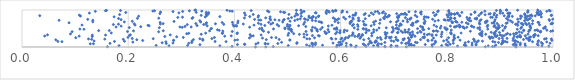
| Category | Series 0 |
|---|---|
| 0.4397582424768291 | 0.001 |
| 0.9306065013908572 | 0.002 |
| 0.45905064466568135 | 0.003 |
| 0.7237459221952459 | 0.004 |
| 0.627939035113636 | 0.005 |
| 0.6833654984516622 | 0.006 |
| 0.8725762796969696 | 0.007 |
| 0.16093497196341988 | 0.008 |
| 0.592542413880383 | 0.009 |
| 0.4730334914781309 | 0.01 |
| 0.8861221907580672 | 0.011 |
| 0.6947858666441654 | 0.012 |
| 0.683654880736637 | 0.013 |
| 0.3955928365395567 | 0.014 |
| 0.5476568008945845 | 0.015 |
| 0.6479818516568191 | 0.016 |
| 0.8899949662903974 | 0.017 |
| 0.7726067595610066 | 0.018 |
| 0.6707475994850652 | 0.019 |
| 0.9288758335606171 | 0.02 |
| 0.9922326241957272 | 0.021 |
| 0.7067391578996007 | 0.022 |
| 0.8201820290631205 | 0.023 |
| 0.6106738642838067 | 0.024 |
| 0.7044417234368779 | 0.025 |
| 0.6294474489301293 | 0.026 |
| 0.5413794025680093 | 0.027 |
| 0.9792913036521915 | 0.028 |
| 0.8780104582182556 | 0.029 |
| 0.37267117728008076 | 0.03 |
| 0.2768716669511784 | 0.031 |
| 0.9480298406155264 | 0.032 |
| 0.6199840227202453 | 0.033 |
| 0.6619571355454509 | 0.034 |
| 0.18266965576157063 | 0.035 |
| 0.8361605614147365 | 0.036 |
| 0.3117633460813789 | 0.037 |
| 0.790365009153304 | 0.038 |
| 0.5014256973000555 | 0.039 |
| 0.801803901243772 | 0.04 |
| 0.7383309946841438 | 0.041 |
| 0.2526202056550569 | 0.042 |
| 0.8339017023034863 | 0.043 |
| 0.6952844717494677 | 0.044 |
| 0.5971870194827564 | 0.045 |
| 0.7336272615109689 | 0.046 |
| 0.5660099925702582 | 0.047 |
| 0.7288850378932779 | 0.048 |
| 0.5933533301236843 | 0.049 |
| 0.6692634076765457 | 0.05 |
| 0.8923122747983209 | 0.051 |
| 0.9721107230061647 | 0.052 |
| 0.8552057277014337 | 0.053 |
| 0.8475790365505581 | 0.054 |
| 0.9308096741542663 | 0.055 |
| 0.6450869756310679 | 0.056 |
| 0.5359674929827138 | 0.057 |
| 0.6190773410810242 | 0.058 |
| 0.8329864053565965 | 0.059 |
| 0.772175240070705 | 0.06 |
| 0.9383104013218859 | 0.061 |
| 0.3350387867544831 | 0.062 |
| 0.5523770347545228 | 0.063 |
| 0.9250413176067294 | 0.064 |
| 0.6000381439607686 | 0.065 |
| 0.4057358930435871 | 0.066 |
| 0.7595085625792112 | 0.067 |
| 0.7986880469913847 | 0.068 |
| 0.6522755969845091 | 0.069 |
| 0.4194467273299296 | 0.07 |
| 0.5466725327784752 | 0.071 |
| 0.7324114684003323 | 0.072 |
| 0.8550696682368828 | 0.073 |
| 0.806328378153701 | 0.074 |
| 0.6020656587611511 | 0.075 |
| 0.4190033491986625 | 0.076 |
| 0.9703848851121417 | 0.077 |
| 0.7326744415356399 | 0.078 |
| 0.9029811242468271 | 0.079 |
| 0.6768479442541693 | 0.08 |
| 0.4404542227759458 | 0.081 |
| 0.6426695310158304 | 0.082 |
| 0.9472907652219515 | 0.083 |
| 0.7761549709987637 | 0.084 |
| 0.46326782165340946 | 0.085 |
| 0.128500594103624 | 0.086 |
| 0.45808541655429097 | 0.087 |
| 0.1344220684928971 | 0.088 |
| 0.6714808646532138 | 0.089 |
| 0.9802851968661976 | 0.09 |
| 0.7227599620286055 | 0.091 |
| 0.5476559091503768 | 0.092 |
| 0.4817701208243884 | 0.093 |
| 0.27179629245290976 | 0.094 |
| 0.4582539838530219 | 0.095 |
| 0.5174969212528008 | 0.096 |
| 0.928099881278443 | 0.097 |
| 0.16577344483976106 | 0.098 |
| 0.6108727488720841 | 0.099 |
| 0.31403229731486565 | 0.1 |
| 0.8123347312741905 | 0.101 |
| 0.9943878482873181 | 0.102 |
| 0.5457206383565661 | 0.103 |
| 0.9385067285459505 | 0.104 |
| 0.7283064310556521 | 0.105 |
| 0.5857476662627418 | 0.106 |
| 0.28437573407253375 | 0.107 |
| 0.8476666464722052 | 0.108 |
| 0.4446778232376353 | 0.109 |
| 0.5528912196933847 | 0.11 |
| 0.714909511922426 | 0.111 |
| 0.726097819725797 | 0.112 |
| 0.6582129797654425 | 0.113 |
| 0.9054849382932397 | 0.114 |
| 0.263945958838259 | 0.115 |
| 0.8347812338674323 | 0.116 |
| 0.7441785159034859 | 0.117 |
| 0.5179235221876486 | 0.118 |
| 0.6554074812832449 | 0.119 |
| 0.978014111455429 | 0.12 |
| 0.3197570025185871 | 0.121 |
| 0.5966648548342794 | 0.122 |
| 0.8973264029374248 | 0.123 |
| 0.6834927672056559 | 0.124 |
| 0.6650257340749395 | 0.125 |
| 0.48884590701903197 | 0.126 |
| 0.741009175812642 | 0.127 |
| 0.9049097139846919 | 0.128 |
| 0.5993736760383804 | 0.129 |
| 0.7789724845145493 | 0.13 |
| 0.8029887373958056 | 0.131 |
| 0.20873162991225366 | 0.132 |
| 0.8906480461428249 | 0.133 |
| 0.9135301137160078 | 0.134 |
| 0.8569139575846726 | 0.135 |
| 0.9336825593443574 | 0.136 |
| 0.6648367952596044 | 0.137 |
| 0.6552610683249024 | 0.138 |
| 0.9881876928510416 | 0.139 |
| 0.9717037782528212 | 0.14 |
| 0.2709669070166084 | 0.141 |
| 0.840784952578503 | 0.142 |
| 0.9615437111511197 | 0.143 |
| 0.0752330270776588 | 0.144 |
| 0.6675978947679491 | 0.145 |
| 0.3843443753921758 | 0.146 |
| 0.9098107727249628 | 0.147 |
| 0.886687853121969 | 0.148 |
| 0.3636486608411398 | 0.149 |
| 0.06757905644450751 | 0.15 |
| 0.17415501083521728 | 0.151 |
| 0.8526609079278437 | 0.152 |
| 0.7001294252184086 | 0.153 |
| 0.19301128861674618 | 0.154 |
| 0.6042471286513494 | 0.155 |
| 0.6559565395820836 | 0.156 |
| 0.778521484543587 | 0.157 |
| 0.8671423556707127 | 0.158 |
| 0.9295267946281064 | 0.159 |
| 0.3200716660214945 | 0.16 |
| 0.7292195772132313 | 0.161 |
| 0.13576714626574882 | 0.162 |
| 0.9280402782555909 | 0.163 |
| 0.7940986808306106 | 0.164 |
| 0.7648530476050951 | 0.165 |
| 0.905989669473316 | 0.166 |
| 0.8593733833149108 | 0.167 |
| 0.9290235429054389 | 0.168 |
| 0.6954909473677985 | 0.169 |
| 0.6665997862081255 | 0.17 |
| 0.9726858438960366 | 0.171 |
| 0.8120204125184383 | 0.172 |
| 0.9056504279604051 | 0.173 |
| 0.9547303136482571 | 0.174 |
| 0.22728748999846282 | 0.175 |
| 0.2854671600535836 | 0.176 |
| 0.7078144893543508 | 0.177 |
| 0.9978623721093367 | 0.178 |
| 0.9249161931790494 | 0.179 |
| 0.3405799540827344 | 0.18 |
| 0.28549859494760416 | 0.181 |
| 0.7071028473175551 | 0.182 |
| 0.772064888886028 | 0.183 |
| 0.40088916529883634 | 0.184 |
| 0.8249988537032112 | 0.185 |
| 0.764256107716562 | 0.186 |
| 0.5043405717286213 | 0.187 |
| 0.956470822949223 | 0.188 |
| 0.7178688076475236 | 0.189 |
| 0.5046179421882743 | 0.19 |
| 0.7998688682587701 | 0.191 |
| 0.9561568080405116 | 0.192 |
| 0.405796986752596 | 0.193 |
| 0.06369873648318244 | 0.194 |
| 0.7297657459621126 | 0.195 |
| 0.643721035615434 | 0.196 |
| 0.21626446475492636 | 0.197 |
| 0.8512992015559172 | 0.198 |
| 0.4600756055984458 | 0.199 |
| 0.32280928368547335 | 0.2 |
| 0.7506452984735504 | 0.201 |
| 0.704971641212876 | 0.202 |
| 0.9445942750561502 | 0.203 |
| 0.8130062444618413 | 0.204 |
| 0.4842982283725431 | 0.205 |
| 0.6764771922721993 | 0.206 |
| 0.1907557632537843 | 0.207 |
| 0.13119193756320596 | 0.208 |
| 0.340425235328573 | 0.209 |
| 0.8505088533787807 | 0.21 |
| 0.6076904006754811 | 0.211 |
| 0.7178189693155569 | 0.212 |
| 0.15598364822997682 | 0.213 |
| 0.6004841881846844 | 0.214 |
| 0.5836501632658271 | 0.215 |
| 0.9840563760734663 | 0.216 |
| 0.12527609103149326 | 0.217 |
| 0.5910541176758058 | 0.218 |
| 0.9967520239593749 | 0.219 |
| 0.5417601212198916 | 0.22 |
| 0.536660113120931 | 0.221 |
| 0.7200952417454632 | 0.222 |
| 0.33497940721588515 | 0.223 |
| 0.9532053968276173 | 0.224 |
| 0.24711499053800134 | 0.225 |
| 0.6529362121278061 | 0.226 |
| 0.3575578873032818 | 0.227 |
| 0.9873271934120542 | 0.228 |
| 0.8984598607150192 | 0.229 |
| 0.2075782404318102 | 0.23 |
| 0.8817115414730372 | 0.231 |
| 0.9251681802679272 | 0.232 |
| 0.913402082103097 | 0.233 |
| 0.8148092712689423 | 0.234 |
| 0.6365866434000123 | 0.235 |
| 0.5823099655253737 | 0.236 |
| 0.6024335985289277 | 0.237 |
| 0.9501260295517759 | 0.238 |
| 0.6847414355846674 | 0.239 |
| 0.45287333171246524 | 0.24 |
| 0.9047321245259362 | 0.241 |
| 0.6928400171269505 | 0.242 |
| 0.7749526458169351 | 0.243 |
| 0.7276537164617517 | 0.244 |
| 0.42841625753314244 | 0.245 |
| 0.8869406969678225 | 0.246 |
| 0.6695280034562198 | 0.247 |
| 0.5509173140791381 | 0.248 |
| 0.7575674883557049 | 0.249 |
| 0.8033240132623437 | 0.25 |
| 0.10127520197496556 | 0.251 |
| 0.6140268317693196 | 0.252 |
| 0.6096043672017895 | 0.253 |
| 0.47833119720412726 | 0.254 |
| 0.6746718681869771 | 0.255 |
| 0.4698667691678758 | 0.256 |
| 0.36236454568616333 | 0.257 |
| 0.30380434805095496 | 0.258 |
| 0.7548897008068617 | 0.259 |
| 0.6918806689814829 | 0.26 |
| 0.1995789252691707 | 0.261 |
| 0.7039730214280847 | 0.262 |
| 0.9557090888999689 | 0.263 |
| 0.8213752064961062 | 0.264 |
| 0.7329581750357338 | 0.265 |
| 0.9326393539542939 | 0.266 |
| 0.6953681367594868 | 0.267 |
| 0.5313854888896647 | 0.268 |
| 0.884070524171767 | 0.269 |
| 0.9576853639201416 | 0.27 |
| 0.8135335085496259 | 0.271 |
| 0.9390027333543158 | 0.272 |
| 0.9638244978731638 | 0.273 |
| 0.8797301039294866 | 0.274 |
| 0.7335799470401801 | 0.275 |
| 0.2913126820844504 | 0.276 |
| 0.6384264889476642 | 0.277 |
| 0.9383727708650739 | 0.278 |
| 0.7577195908331642 | 0.279 |
| 0.9378261046701984 | 0.28 |
| 0.9329993775249009 | 0.281 |
| 0.7897527820734499 | 0.282 |
| 0.1322804789881547 | 0.283 |
| 0.8931094928199063 | 0.284 |
| 0.2690088508758282 | 0.285 |
| 0.6860968598795508 | 0.286 |
| 0.6323168391732525 | 0.287 |
| 0.6270578813814057 | 0.288 |
| 0.7401320176136307 | 0.289 |
| 0.43149100870509427 | 0.29 |
| 0.9270412657977214 | 0.291 |
| 0.8909109748626789 | 0.292 |
| 0.3818133725040228 | 0.293 |
| 0.10767000283172662 | 0.294 |
| 0.6164502444612769 | 0.295 |
| 0.04277510151570869 | 0.296 |
| 0.9383155314214834 | 0.297 |
| 0.5599288610829584 | 0.298 |
| 0.7339793131148543 | 0.299 |
| 0.8663436219162478 | 0.3 |
| 0.3940512308593839 | 0.301 |
| 0.4354093628040043 | 0.302 |
| 0.6585926227296713 | 0.303 |
| 0.907486193780197 | 0.304 |
| 0.9478239562979881 | 0.305 |
| 0.9721366931927745 | 0.306 |
| 0.8948887928138027 | 0.307 |
| 0.558103736442747 | 0.308 |
| 0.903756483611857 | 0.309 |
| 0.5468694376664684 | 0.31 |
| 0.9635302784001093 | 0.311 |
| 0.9644842453515979 | 0.312 |
| 0.7721972538403773 | 0.313 |
| 0.6214975960028959 | 0.314 |
| 0.20258668387123918 | 0.315 |
| 0.6342073030580457 | 0.316 |
| 0.5009856217987457 | 0.317 |
| 0.9373905382287913 | 0.318 |
| 0.8140254716205799 | 0.319 |
| 0.6413728795622653 | 0.32 |
| 0.1323585290870167 | 0.321 |
| 0.7801532112422994 | 0.322 |
| 0.15735276555535976 | 0.323 |
| 0.900574054337971 | 0.324 |
| 0.966599307594584 | 0.325 |
| 0.4503115197978316 | 0.326 |
| 0.27915740293504526 | 0.327 |
| 0.20406522393300977 | 0.328 |
| 0.048002066363245215 | 0.329 |
| 0.863275429781671 | 0.33 |
| 0.5365755803726542 | 0.331 |
| 0.7633150451915186 | 0.332 |
| 0.7722121767343232 | 0.333 |
| 0.42956704102181137 | 0.334 |
| 0.7306973728610897 | 0.335 |
| 0.7364073712718966 | 0.336 |
| 0.641016004079567 | 0.337 |
| 0.9113689854145689 | 0.338 |
| 0.9193591676338525 | 0.339 |
| 0.6844919243712689 | 0.34 |
| 0.5223886270704037 | 0.341 |
| 0.9658052426322717 | 0.342 |
| 0.6346642572054112 | 0.343 |
| 0.8732332223941051 | 0.344 |
| 0.33745249567191776 | 0.345 |
| 0.9528447538738447 | 0.346 |
| 0.790230808259809 | 0.347 |
| 0.5309175241245954 | 0.348 |
| 0.7669183985114635 | 0.349 |
| 0.6236419253433851 | 0.35 |
| 0.7574282411804071 | 0.351 |
| 0.888906339003526 | 0.352 |
| 0.09125663644659217 | 0.353 |
| 0.8893547025487426 | 0.354 |
| 0.8616971853195803 | 0.355 |
| 0.925804261104407 | 0.356 |
| 0.8086095876797492 | 0.357 |
| 0.8660820194980356 | 0.358 |
| 0.31021970955999456 | 0.359 |
| 0.5905454488080464 | 0.36 |
| 0.511677647508238 | 0.361 |
| 0.4050015646725836 | 0.362 |
| 0.8909879497326996 | 0.363 |
| 0.807615867350336 | 0.364 |
| 0.9143068638427397 | 0.365 |
| 0.9300447147616225 | 0.366 |
| 0.5719408606368248 | 0.367 |
| 0.658749520598123 | 0.368 |
| 0.3771929921947803 | 0.369 |
| 0.31400644686461987 | 0.37 |
| 0.5022559265387744 | 0.371 |
| 0.9317662481246844 | 0.372 |
| 0.5735837317458974 | 0.373 |
| 0.34584374171806487 | 0.374 |
| 0.377754419086543 | 0.375 |
| 0.9306590191834921 | 0.376 |
| 0.6875705143875184 | 0.377 |
| 0.8269690435156477 | 0.378 |
| 0.7310768682445552 | 0.379 |
| 0.16813161498970658 | 0.38 |
| 0.40553789429519205 | 0.381 |
| 0.6231406454349024 | 0.382 |
| 0.5983551639823474 | 0.383 |
| 0.7449677804589271 | 0.384 |
| 0.8650427792334697 | 0.385 |
| 0.6477471133566293 | 0.386 |
| 0.7071818943540101 | 0.387 |
| 0.9413620759191175 | 0.388 |
| 0.8896786310614159 | 0.389 |
| 0.8075012633479544 | 0.39 |
| 0.6838753749929544 | 0.391 |
| 0.899172732252995 | 0.392 |
| 0.5984717712034879 | 0.393 |
| 0.7169331959878289 | 0.394 |
| 0.7077388127858865 | 0.395 |
| 0.8837314683452675 | 0.396 |
| 0.6968024377208917 | 0.397 |
| 0.46419912556103327 | 0.398 |
| 0.7217553941247067 | 0.399 |
| 0.727199028557434 | 0.4 |
| 0.7514422067314047 | 0.401 |
| 0.5929545219011392 | 0.402 |
| 0.7910412057631161 | 0.403 |
| 0.7257643552894264 | 0.404 |
| 0.6064049901106701 | 0.405 |
| 0.6622374903368426 | 0.406 |
| 0.7353053690954604 | 0.407 |
| 0.9760382143322068 | 0.408 |
| 0.9364601292404071 | 0.409 |
| 0.5779525101868769 | 0.41 |
| 0.9764525048838149 | 0.411 |
| 0.2573327728150806 | 0.412 |
| 0.5702004911179603 | 0.413 |
| 0.09437030183568973 | 0.414 |
| 0.5080295730922351 | 0.415 |
| 0.8664512950473483 | 0.416 |
| 0.19862493518261815 | 0.417 |
| 0.9543460136038999 | 0.418 |
| 0.39591630602648303 | 0.419 |
| 0.5348402828142416 | 0.42 |
| 0.7497746006931828 | 0.421 |
| 0.9767573279313749 | 0.422 |
| 0.7828862827491727 | 0.423 |
| 0.9958225264964806 | 0.424 |
| 0.8444046191148235 | 0.425 |
| 0.5562537895796988 | 0.426 |
| 0.45492366267047624 | 0.427 |
| 0.7752794716475954 | 0.428 |
| 0.8925721100044943 | 0.429 |
| 0.7139379317727739 | 0.43 |
| 0.3782078684789347 | 0.431 |
| 0.5458536222928128 | 0.432 |
| 0.774359293058749 | 0.433 |
| 0.6991214328752569 | 0.434 |
| 0.3533247935655623 | 0.435 |
| 0.20997098180163556 | 0.436 |
| 0.9995302081348104 | 0.437 |
| 0.7802727511111209 | 0.438 |
| 0.2660563952142053 | 0.439 |
| 0.612127321763619 | 0.44 |
| 0.9717304232193864 | 0.441 |
| 0.5991131155535181 | 0.442 |
| 0.14441217314347402 | 0.443 |
| 0.9057536938091564 | 0.444 |
| 0.16443372750943527 | 0.445 |
| 0.6493858697671615 | 0.446 |
| 0.9449945537182584 | 0.447 |
| 0.9550965893297102 | 0.448 |
| 0.6534009197847379 | 0.449 |
| 0.3714163061043407 | 0.45 |
| 0.9661543551997518 | 0.451 |
| 0.5552788745730051 | 0.452 |
| 0.9885584063460031 | 0.453 |
| 0.6680577492714033 | 0.454 |
| 0.9447030185513792 | 0.455 |
| 0.6073600719967427 | 0.456 |
| 0.8085145129333529 | 0.457 |
| 0.5064105209721986 | 0.458 |
| 0.5061868303599949 | 0.459 |
| 0.4525208417623794 | 0.46 |
| 0.5066500152016172 | 0.461 |
| 0.7211981398417424 | 0.462 |
| 0.5453339862194542 | 0.463 |
| 0.9699580513113201 | 0.464 |
| 0.3680944734384801 | 0.465 |
| 0.9568231733893174 | 0.466 |
| 0.7566279123156068 | 0.467 |
| 0.6623454993203645 | 0.468 |
| 0.8623161462387768 | 0.469 |
| 0.576368646710749 | 0.47 |
| 0.7991223092247441 | 0.471 |
| 0.5073190716734 | 0.472 |
| 0.7285762267821341 | 0.473 |
| 0.5556260725051432 | 0.474 |
| 0.7548461778026151 | 0.475 |
| 0.7094715485555365 | 0.476 |
| 0.6324249347674801 | 0.477 |
| 0.9327216717150141 | 0.478 |
| 0.5623190617868857 | 0.479 |
| 0.11670459450904669 | 0.48 |
| 0.5933334121029632 | 0.481 |
| 0.5911982141877167 | 0.482 |
| 0.8772266558133017 | 0.483 |
| 0.8956918027311016 | 0.484 |
| 0.10902680532328327 | 0.485 |
| 0.6437336374317945 | 0.486 |
| 0.8008972789323073 | 0.487 |
| 0.4735554824061505 | 0.488 |
| 0.5017908197074367 | 0.489 |
| 0.6479259949366393 | 0.49 |
| 0.35569491826592486 | 0.491 |
| 0.6994402329345224 | 0.492 |
| 0.44741831551215067 | 0.493 |
| 0.588119265435381 | 0.494 |
| 0.4952048128694363 | 0.495 |
| 0.7660489869024587 | 0.496 |
| 0.7449105299165746 | 0.497 |
| 0.6425418710658981 | 0.498 |
| 0.7076771760443981 | 0.499 |
| 0.8971088044200781 | 0.5 |
| 0.5036670099445745 | 0.501 |
| 0.35691960533679784 | 0.502 |
| 0.7970808545523853 | 0.503 |
| 0.7047147400772913 | 0.504 |
| 0.9393174665378741 | 0.505 |
| 0.9821393435837774 | 0.506 |
| 0.8331046888662332 | 0.507 |
| 0.9853371174019026 | 0.508 |
| 0.9092017239550689 | 0.509 |
| 0.7877520503893366 | 0.51 |
| 0.4515248126605207 | 0.511 |
| 0.7057699002690104 | 0.512 |
| 0.858401886105906 | 0.513 |
| 0.6724051224375442 | 0.514 |
| 0.49520854850770696 | 0.515 |
| 0.6257871621664433 | 0.516 |
| 0.5520140914185067 | 0.517 |
| 0.6859914005234733 | 0.518 |
| 0.9583485420458052 | 0.519 |
| 0.5926095680074123 | 0.52 |
| 0.8957794562277853 | 0.521 |
| 0.2586587460809253 | 0.522 |
| 0.7963676716264636 | 0.523 |
| 0.8925022271983564 | 0.524 |
| 0.20210926118341077 | 0.525 |
| 0.8619033738934636 | 0.526 |
| 0.7540042189656043 | 0.527 |
| 0.565564556125157 | 0.528 |
| 0.8990476181887813 | 0.529 |
| 0.8312559500308712 | 0.53 |
| 0.3017467832823765 | 0.531 |
| 0.6977476467204735 | 0.532 |
| 0.8377003498734362 | 0.533 |
| 0.547340582560207 | 0.534 |
| 0.8508955842159112 | 0.535 |
| 0.4287190629268465 | 0.536 |
| 0.940922843552737 | 0.537 |
| 0.8242742092570335 | 0.538 |
| 0.7544634026481551 | 0.539 |
| 0.17715394481415841 | 0.54 |
| 0.2973707125061305 | 0.541 |
| 0.3185987199246789 | 0.542 |
| 0.8143177793328796 | 0.543 |
| 0.8162364740971702 | 0.544 |
| 0.8303852502249235 | 0.545 |
| 0.9854633110000619 | 0.546 |
| 0.956537271071971 | 0.547 |
| 0.22366002756531614 | 0.548 |
| 0.9106070608501289 | 0.549 |
| 0.7807477279601323 | 0.55 |
| 0.8762427272847193 | 0.551 |
| 0.5344627606167861 | 0.552 |
| 0.8255471987557786 | 0.553 |
| 0.5034640079121577 | 0.554 |
| 0.3068609239454137 | 0.555 |
| 0.8887930224161574 | 0.556 |
| 0.8470272622844268 | 0.557 |
| 0.6328866432808256 | 0.558 |
| 0.7505800263541649 | 0.559 |
| 0.49974601882258934 | 0.56 |
| 0.8186284859397923 | 0.561 |
| 0.39910678506194164 | 0.562 |
| 0.7891155428104654 | 0.563 |
| 0.4040487585549022 | 0.564 |
| 0.1866974013666697 | 0.565 |
| 0.8067630218850814 | 0.566 |
| 0.5768761316892562 | 0.567 |
| 0.4835448475793458 | 0.568 |
| 0.7107364259470631 | 0.569 |
| 0.8465838436708267 | 0.57 |
| 0.3487421172283794 | 0.571 |
| 0.6575325025850626 | 0.572 |
| 0.8242019116861888 | 0.573 |
| 0.23944088583046516 | 0.574 |
| 0.5209410717153448 | 0.575 |
| 0.9568597731290482 | 0.576 |
| 0.9046994722486161 | 0.577 |
| 0.6222792906805105 | 0.578 |
| 0.32972805708251 | 0.579 |
| 0.4032028552107226 | 0.58 |
| 0.4573059051262478 | 0.581 |
| 0.8976738568246455 | 0.582 |
| 0.8901750081580033 | 0.583 |
| 0.9335465145350124 | 0.584 |
| 0.7360768964952152 | 0.585 |
| 0.23723640328683065 | 0.586 |
| 0.504775214650162 | 0.587 |
| 0.8771006727124563 | 0.588 |
| 0.5837366380804777 | 0.589 |
| 0.7760323166920454 | 0.59 |
| 0.436910383225852 | 0.591 |
| 0.2129153464970628 | 0.592 |
| 0.11299510689083399 | 0.593 |
| 0.6477328736530771 | 0.594 |
| 0.7050443432663019 | 0.595 |
| 0.7330664650047649 | 0.596 |
| 0.8230293854156107 | 0.597 |
| 0.644495271912072 | 0.598 |
| 0.7143759147095476 | 0.599 |
| 0.39749687386849464 | 0.6 |
| 0.9745924668387753 | 0.601 |
| 0.9437029654439902 | 0.602 |
| 0.950456811035251 | 0.603 |
| 0.6319804681746662 | 0.604 |
| 0.311200734451991 | 0.605 |
| 0.48054610717710905 | 0.606 |
| 0.1720832573118226 | 0.607 |
| 0.3421369431141265 | 0.608 |
| 0.49996521092571194 | 0.609 |
| 0.6242338878570604 | 0.61 |
| 0.6632013986250631 | 0.611 |
| 0.3800041619326859 | 0.612 |
| 0.4501027722646903 | 0.613 |
| 0.9295550527359767 | 0.614 |
| 0.5303845328599232 | 0.615 |
| 0.18165480514217458 | 0.616 |
| 0.46867976010567186 | 0.617 |
| 0.644592514138406 | 0.618 |
| 0.8621724792119373 | 0.619 |
| 0.416761075847265 | 0.62 |
| 0.34623242978135393 | 0.621 |
| 0.2605842254949567 | 0.622 |
| 0.9962677664694655 | 0.623 |
| 0.8403045926779702 | 0.624 |
| 0.9323778217305586 | 0.625 |
| 0.7124481829154162 | 0.626 |
| 0.36429881252080065 | 0.627 |
| 0.2112542071559908 | 0.628 |
| 0.9612299437373506 | 0.629 |
| 0.2657662263110686 | 0.63 |
| 0.9418571195767648 | 0.631 |
| 0.6179502711275329 | 0.632 |
| 0.7578994285825571 | 0.633 |
| 0.327365576610013 | 0.634 |
| 0.9546409817547337 | 0.635 |
| 0.8948256467352117 | 0.636 |
| 0.9403848864414255 | 0.637 |
| 0.9992244569010617 | 0.638 |
| 0.6735806428860701 | 0.639 |
| 0.91174186795795 | 0.64 |
| 0.44520372025370275 | 0.641 |
| 0.7362872518030178 | 0.642 |
| 0.7356875143673933 | 0.643 |
| 0.9980912248731872 | 0.644 |
| 0.9482419533691643 | 0.645 |
| 0.8613060839913339 | 0.646 |
| 0.8851931614268699 | 0.647 |
| 0.47222594936327955 | 0.648 |
| 0.8884839477979161 | 0.649 |
| 0.4063235417693632 | 0.65 |
| 0.7570926139032974 | 0.651 |
| 0.8369572550549146 | 0.652 |
| 0.9137457279278554 | 0.653 |
| 0.08859858180728693 | 0.654 |
| 0.872966014179253 | 0.655 |
| 0.3476316560728441 | 0.656 |
| 0.5956426379460177 | 0.657 |
| 0.5643777180042086 | 0.658 |
| 0.9733828573492266 | 0.659 |
| 0.8102114013204098 | 0.66 |
| 0.8110221468609817 | 0.661 |
| 0.37703341297063736 | 0.662 |
| 0.2601298517258737 | 0.663 |
| 0.39627088603439037 | 0.664 |
| 0.4645718292059551 | 0.665 |
| 0.5322964775590321 | 0.666 |
| 0.971720359207996 | 0.667 |
| 0.828283234956335 | 0.668 |
| 0.9235486080579157 | 0.669 |
| 0.8192832985253917 | 0.67 |
| 0.6178068231238305 | 0.671 |
| 0.7420442791326882 | 0.672 |
| 0.6621381188252041 | 0.673 |
| 0.705275431042495 | 0.674 |
| 0.33663486782665725 | 0.675 |
| 0.4909889721340182 | 0.676 |
| 0.5631113868096896 | 0.677 |
| 0.19267355064163386 | 0.678 |
| 0.9349211647425589 | 0.679 |
| 0.133302191504126 | 0.68 |
| 0.7260575796304463 | 0.681 |
| 0.6939376778171334 | 0.682 |
| 0.5594221971750233 | 0.683 |
| 0.7428242243010414 | 0.684 |
| 0.8729187189956303 | 0.685 |
| 0.8094227918931025 | 0.686 |
| 0.8168172732015406 | 0.687 |
| 0.6207689159229719 | 0.688 |
| 0.8898141452376609 | 0.689 |
| 0.5893560960215231 | 0.69 |
| 0.28627827447174137 | 0.691 |
| 0.6427418379634366 | 0.692 |
| 0.7591213765107552 | 0.693 |
| 0.8170087731460449 | 0.694 |
| 0.8759583461624324 | 0.695 |
| 0.2077622522866688 | 0.696 |
| 0.5048049093934597 | 0.697 |
| 0.7453958149330172 | 0.698 |
| 0.6658065498936202 | 0.699 |
| 0.777603287251048 | 0.7 |
| 0.4068578257419469 | 0.701 |
| 0.7175591960425473 | 0.702 |
| 0.6202454242485174 | 0.703 |
| 0.8755238967916023 | 0.704 |
| 0.9201375707887172 | 0.705 |
| 0.8621520061181469 | 0.706 |
| 0.8451597999123093 | 0.707 |
| 0.5530131206307651 | 0.708 |
| 0.961723604637486 | 0.709 |
| 0.946492461997466 | 0.71 |
| 0.3348748120445132 | 0.711 |
| 0.6350410811866388 | 0.712 |
| 0.8422588170065753 | 0.713 |
| 0.6335825486636922 | 0.714 |
| 0.7082168186154038 | 0.715 |
| 0.9933596558900214 | 0.716 |
| 0.5138031759075337 | 0.717 |
| 0.5467635806881079 | 0.718 |
| 0.7840028714003007 | 0.719 |
| 0.8041424105698766 | 0.72 |
| 0.4922677766252274 | 0.721 |
| 0.06983769454853675 | 0.722 |
| 0.48420844665144464 | 0.723 |
| 0.13340483157331254 | 0.724 |
| 0.7968631135178891 | 0.725 |
| 0.44969431904667123 | 0.726 |
| 0.8021104582670051 | 0.727 |
| 0.44594909484184897 | 0.728 |
| 0.538157073676725 | 0.729 |
| 0.9158504324107183 | 0.73 |
| 0.4682330553684578 | 0.731 |
| 0.5933154368747932 | 0.732 |
| 0.9521395703346948 | 0.733 |
| 0.6746321593508933 | 0.734 |
| 0.8907479290786313 | 0.735 |
| 0.476297036440389 | 0.736 |
| 0.8644814675660629 | 0.737 |
| 0.795018591606048 | 0.738 |
| 0.18658398698005563 | 0.739 |
| 0.9927157071406891 | 0.74 |
| 0.7257121385243984 | 0.741 |
| 0.949853619686599 | 0.742 |
| 0.8396831052263438 | 0.743 |
| 0.4937443197679632 | 0.744 |
| 0.5189981322133586 | 0.745 |
| 0.43804325408194483 | 0.746 |
| 0.1237868423368455 | 0.747 |
| 0.5337455050497082 | 0.748 |
| 0.7732741553929248 | 0.749 |
| 0.9541614533784325 | 0.75 |
| 0.7304740959050776 | 0.751 |
| 0.9995078395184136 | 0.752 |
| 0.9334726860148049 | 0.753 |
| 0.757063770730143 | 0.754 |
| 0.5892980332181431 | 0.755 |
| 0.6239790107095271 | 0.756 |
| 0.806533300820085 | 0.757 |
| 0.8562839004120061 | 0.758 |
| 0.6091898707371303 | 0.759 |
| 0.7309153681154232 | 0.76 |
| 0.5239793626573284 | 0.761 |
| 0.5962536949594691 | 0.762 |
| 0.5320033740086024 | 0.763 |
| 0.6463834333019265 | 0.764 |
| 0.6824510637726816 | 0.765 |
| 0.8532858706209441 | 0.766 |
| 0.466890774928336 | 0.767 |
| 0.5015214898443082 | 0.768 |
| 0.9386127625587058 | 0.769 |
| 0.1818278452666692 | 0.77 |
| 0.9125562054713491 | 0.771 |
| 0.8147889042655404 | 0.772 |
| 0.2174109215128717 | 0.773 |
| 0.3203525949323387 | 0.774 |
| 0.9575065169603105 | 0.775 |
| 0.8149092956961028 | 0.776 |
| 0.8080417138228706 | 0.777 |
| 0.5460370611439309 | 0.778 |
| 0.2575581327384289 | 0.779 |
| 0.8430546368999491 | 0.78 |
| 0.8562250196668031 | 0.781 |
| 0.6337278961517178 | 0.782 |
| 0.7327274899987493 | 0.783 |
| 0.418808314946449 | 0.784 |
| 0.5453256101222822 | 0.785 |
| 0.6230153798376021 | 0.786 |
| 0.45895856094142357 | 0.787 |
| 0.586178920746704 | 0.788 |
| 0.9476085069585245 | 0.789 |
| 0.6810200843482893 | 0.79 |
| 0.5538055160612624 | 0.791 |
| 0.7074595878100012 | 0.792 |
| 0.8073549363812031 | 0.793 |
| 0.7220448070139815 | 0.794 |
| 0.5074525069156993 | 0.795 |
| 0.3217242322346737 | 0.796 |
| 0.540875811651307 | 0.797 |
| 0.837832521776528 | 0.798 |
| 0.2934285099008445 | 0.799 |
| 0.7649450348927029 | 0.8 |
| 0.8857655301277881 | 0.801 |
| 0.6057605316074816 | 0.802 |
| 0.8827029027630283 | 0.803 |
| 0.8931201773207544 | 0.804 |
| 0.7094937493686637 | 0.805 |
| 0.3022782553543974 | 0.806 |
| 0.4446094717472335 | 0.807 |
| 0.949489513831473 | 0.808 |
| 0.6875989400381544 | 0.809 |
| 0.7613300228902281 | 0.81 |
| 0.8023339602322634 | 0.811 |
| 0.978014412338621 | 0.812 |
| 0.3450957916923665 | 0.813 |
| 0.4673126322330022 | 0.814 |
| 0.17345078409536957 | 0.815 |
| 0.7577277820827997 | 0.816 |
| 0.9167035132949463 | 0.817 |
| 0.7437790606781199 | 0.818 |
| 0.5480328639390203 | 0.819 |
| 0.6168686541367934 | 0.82 |
| 0.548222886049759 | 0.821 |
| 0.3725473243576014 | 0.822 |
| 0.4289216288452852 | 0.823 |
| 0.7073504410382081 | 0.824 |
| 0.9155121200371235 | 0.825 |
| 0.5584970628229554 | 0.826 |
| 0.9409746820306639 | 0.827 |
| 0.9233849184984784 | 0.828 |
| 0.6839111731377995 | 0.829 |
| 0.5260590208858767 | 0.83 |
| 0.5138024056278241 | 0.831 |
| 0.21962146534489121 | 0.832 |
| 0.9523628338408385 | 0.833 |
| 0.5404165295305684 | 0.834 |
| 0.6910468042144728 | 0.835 |
| 0.8247666001077005 | 0.836 |
| 0.11011543681073294 | 0.837 |
| 0.9605885289899775 | 0.838 |
| 0.9389271772151265 | 0.839 |
| 0.5589858372275256 | 0.84 |
| 0.6906507371009042 | 0.841 |
| 0.9665438454920194 | 0.842 |
| 0.9081943266447032 | 0.843 |
| 0.9558395846733504 | 0.844 |
| 0.44538533995865454 | 0.845 |
| 0.6538299870807626 | 0.846 |
| 0.033489048494669306 | 0.847 |
| 0.7773612932801046 | 0.848 |
| 0.34792741690712403 | 0.849 |
| 0.947892990913374 | 0.85 |
| 0.8603322301576767 | 0.851 |
| 0.7105797961904127 | 0.852 |
| 0.6916182393623335 | 0.853 |
| 0.9966179283071969 | 0.854 |
| 0.33744074996769463 | 0.855 |
| 0.740452042706678 | 0.856 |
| 0.9972434786436477 | 0.857 |
| 0.8235801450223379 | 0.858 |
| 0.8942411960031602 | 0.859 |
| 0.6232358389713 | 0.86 |
| 0.10796768699462943 | 0.861 |
| 0.42061604482088744 | 0.862 |
| 0.9170490674212665 | 0.863 |
| 0.6260260254771314 | 0.864 |
| 0.8889123396431055 | 0.865 |
| 0.9590873614845679 | 0.866 |
| 0.6278572914158029 | 0.867 |
| 0.8004431164709925 | 0.868 |
| 0.5189521103291255 | 0.869 |
| 0.8043839887020959 | 0.87 |
| 0.8722243315991506 | 0.871 |
| 0.9735645157115418 | 0.872 |
| 0.9764552800943721 | 0.873 |
| 0.7242749479779411 | 0.874 |
| 0.6445266880814416 | 0.875 |
| 0.18381837954890518 | 0.876 |
| 0.7799959867125322 | 0.877 |
| 0.8082595890445362 | 0.878 |
| 0.43544475586882514 | 0.879 |
| 0.8455183954200568 | 0.88 |
| 0.5027282233334013 | 0.881 |
| 0.8146956731913063 | 0.882 |
| 0.973094316889477 | 0.883 |
| 0.6616830199792577 | 0.884 |
| 0.9470956727152742 | 0.885 |
| 0.5171343896802044 | 0.886 |
| 0.7177658361550081 | 0.887 |
| 0.7213166270721716 | 0.888 |
| 0.970667553392707 | 0.889 |
| 0.7518375704654686 | 0.89 |
| 0.7143532341143527 | 0.891 |
| 0.8794163397296221 | 0.892 |
| 0.3467031727184156 | 0.893 |
| 0.3508997115567854 | 0.894 |
| 0.9466343012110967 | 0.895 |
| 0.8143813018838746 | 0.896 |
| 0.6845257887501146 | 0.897 |
| 0.8088063251504914 | 0.898 |
| 0.8636845517800044 | 0.899 |
| 0.8817013203471151 | 0.9 |
| 0.7056477909645301 | 0.901 |
| 0.6465612608645311 | 0.902 |
| 0.25971798355661635 | 0.903 |
| 0.5166012627386302 | 0.904 |
| 0.9782351428691162 | 0.905 |
| 0.573265218787338 | 0.906 |
| 0.5254936925397099 | 0.907 |
| 0.8192887171416556 | 0.908 |
| 0.6726502550569595 | 0.909 |
| 0.9148660134739681 | 0.91 |
| 0.7212999643441043 | 0.911 |
| 0.8898458681324567 | 0.912 |
| 0.9004279604582944 | 0.913 |
| 0.9052876243664841 | 0.914 |
| 0.8202781889369216 | 0.915 |
| 0.9190408756940127 | 0.916 |
| 0.12684940052005328 | 0.917 |
| 0.419099468557064 | 0.918 |
| 0.6287338177879027 | 0.919 |
| 0.9169280740536108 | 0.92 |
| 0.657807448870237 | 0.921 |
| 0.5539035868962844 | 0.922 |
| 0.29550002998377534 | 0.923 |
| 0.552417930008006 | 0.924 |
| 0.8045408267426597 | 0.925 |
| 0.6788711225805009 | 0.926 |
| 0.7747563798376504 | 0.927 |
| 0.35150841066211713 | 0.928 |
| 0.7503704642648833 | 0.929 |
| 0.8656866392209147 | 0.93 |
| 0.9698186650068339 | 0.931 |
| 0.19536085674648349 | 0.932 |
| 0.8525534227391021 | 0.933 |
| 0.4947591321048596 | 0.934 |
| 0.8282967820152823 | 0.935 |
| 0.32817776468511717 | 0.936 |
| 0.3473025794501584 | 0.937 |
| 0.9718754580400603 | 0.938 |
| 0.49262276727539844 | 0.939 |
| 0.6025261351917022 | 0.94 |
| 0.5726400433543731 | 0.941 |
| 0.5786761455482756 | 0.942 |
| 0.952309636765673 | 0.943 |
| 0.9528452640400423 | 0.944 |
| 0.6122415963679831 | 0.945 |
| 0.2609679908207949 | 0.946 |
| 0.527407406728812 | 0.947 |
| 0.8531502377542037 | 0.948 |
| 0.6806823834204139 | 0.949 |
| 0.4650567208252065 | 0.95 |
| 0.7518178355876297 | 0.951 |
| 0.486938215027406 | 0.952 |
| 0.7287734555930822 | 0.953 |
| 0.665215827629961 | 0.954 |
| 0.7409995520905843 | 0.955 |
| 0.7827542708630423 | 0.956 |
| 0.28430681890094106 | 0.957 |
| 0.9761076894360614 | 0.958 |
| 0.5861413275067439 | 0.959 |
| 0.30253458774542374 | 0.96 |
| 0.6696760551301766 | 0.961 |
| 0.5311164434531087 | 0.962 |
| 0.13810682073401723 | 0.963 |
| 0.577296883736079 | 0.964 |
| 0.988305293451257 | 0.965 |
| 0.901126526923312 | 0.966 |
| 0.3958585890747581 | 0.967 |
| 0.8717099659200133 | 0.968 |
| 0.33856854892542015 | 0.969 |
| 0.8037793109993967 | 0.97 |
| 0.24641497532381446 | 0.971 |
| 0.39149942492417017 | 0.972 |
| 0.9947328441589471 | 0.973 |
| 0.4623706695900872 | 0.974 |
| 0.7839663652315285 | 0.975 |
| 0.5910760848537194 | 0.976 |
| 0.6036691925816257 | 0.977 |
| 0.315216659223802 | 0.978 |
| 0.24950509288538497 | 0.979 |
| 0.584940134712671 | 0.98 |
| 0.9528181799513848 | 0.981 |
| 0.1572286794652535 | 0.982 |
| 0.4316444368287539 | 0.983 |
| 0.8037479963582684 | 0.984 |
| 0.5741418528922279 | 0.985 |
| 0.18549605314117773 | 0.986 |
| 0.8934301330707741 | 0.987 |
| 0.15909557345145214 | 0.988 |
| 0.992688458082725 | 0.989 |
| 0.5167845511382573 | 0.99 |
| 0.5904768026662741 | 0.991 |
| 0.38614294471954796 | 0.992 |
| 0.9333755982310056 | 0.993 |
| 0.9006680463352064 | 0.994 |
| 0.3256839703031604 | 0.995 |
| 0.5253256666445097 | 0.996 |
| 0.912617119878566 | 0.997 |
| 0.9126005097909003 | 0.998 |
| 0.971203370368637 | 0.999 |
| 0.326836295466762 | 1 |